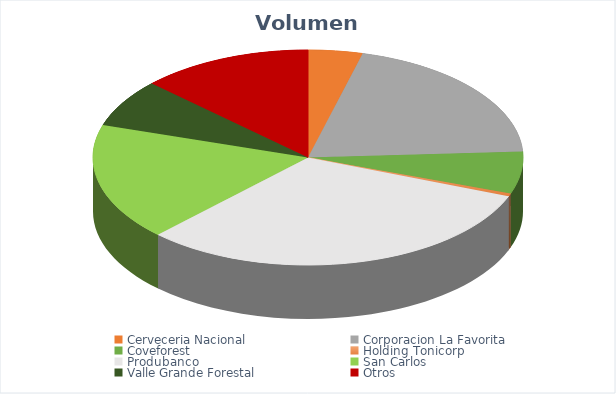
| Category | VOLUMEN ($USD) |
|---|---|
| Cerveceria Nacional | 4900.42 |
| Corporacion La Favorita | 23985 |
| Coveforest | 7602.4 |
| Holding Tonicorp | 499.5 |
| Produbanco | 37625.76 |
| San Carlos | 21105 |
| Valle Grande Forestal | 8603.4 |
| Otros | 15500 |